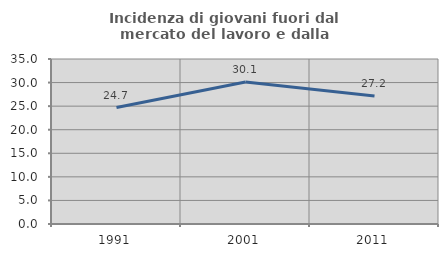
| Category | Incidenza di giovani fuori dal mercato del lavoro e dalla formazione  |
|---|---|
| 1991.0 | 24.702 |
| 2001.0 | 30.13 |
| 2011.0 | 27.153 |